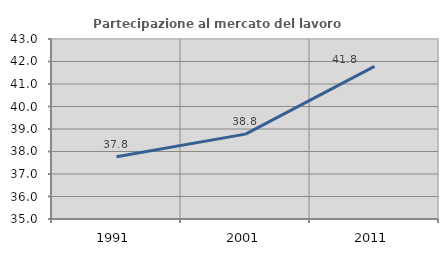
| Category | Partecipazione al mercato del lavoro  femminile |
|---|---|
| 1991.0 | 37.769 |
| 2001.0 | 38.772 |
| 2011.0 | 41.784 |